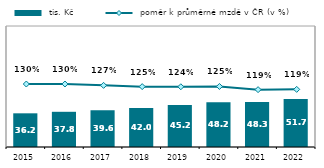
| Category |  tis. Kč |
|---|---|
| 2015.0 | 36.187 |
| 2016.0 | 37.825 |
| 2017.0 | 39.612 |
| 2018.0 | 42.016 |
| 2019.0 | 45.219 |
| 2020.0 | 48.175 |
| 2021.0 | 48.322 |
| 2022.0 | 51.688 |